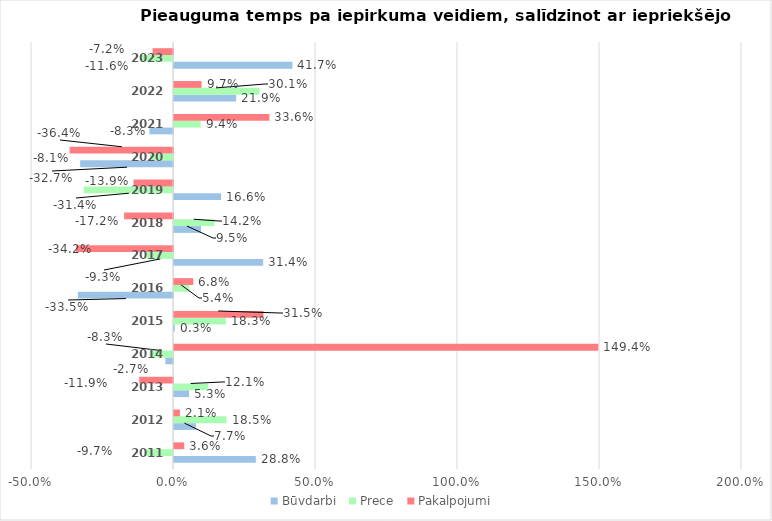
| Category | Būvdarbi | Prece | Pakalpojumi |
|---|---|---|---|
| 2011.0 | 0.288 | -0.097 | 0.036 |
| 2012.0 | 0.077 | 0.185 | 0.021 |
| 2013.0 | 0.053 | 0.121 | -0.119 |
| 2014.0 | -0.027 | -0.083 | 1.494 |
| 2015.0 | 0.003 | 0.183 | 0.315 |
| 2016.0 | -0.335 | 0.054 | 0.068 |
| 2017.0 | 0.314 | -0.093 | -0.342 |
| 2018.0 | 0.095 | 0.142 | -0.172 |
| 2019.0 | 0.166 | -0.314 | -0.139 |
| 2020.0 | -0.327 | -0.081 | -0.364 |
| 2021.0 | -0.083 | 0.094 | 0.336 |
| 2022.0 | 0.219 | 0.301 | 0.097 |
| 2023.0 | 0.417 | -0.116 | -0.072 |